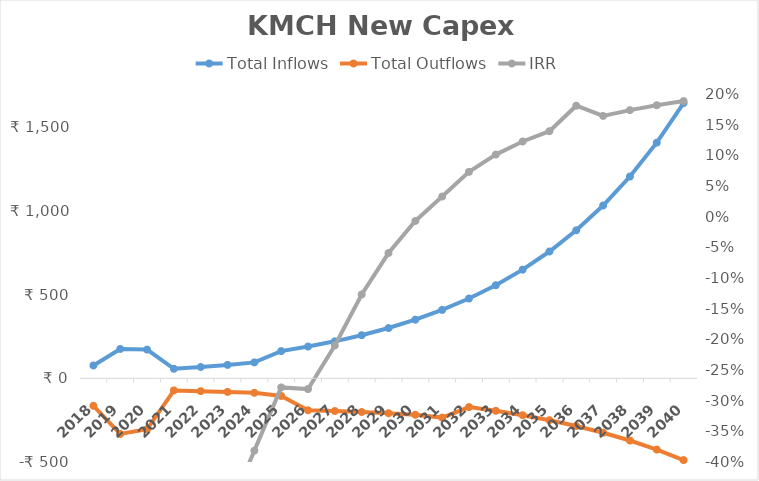
| Category | Total Inflows | Total Outflows |
|---|---|---|
| 2018.0 | 77 | -164.111 |
| 2019.0 | 176 | -332.171 |
| 2020.0 | 172 | -304.372 |
| 2021.0 | 57.296 | -72.133 |
| 2022.0 | 67.898 | -76.31 |
| 2023.0 | 80.465 | -81.055 |
| 2024.0 | 95.363 | -86.462 |
| 2025.0 | 163.026 | -105.145 |
| 2026.0 | 189.975 | -190.882 |
| 2027.0 | 221.415 | -195.234 |
| 2028.0 | 258.102 | -200.996 |
| 2029.0 | 300.916 | -208.391 |
| 2030.0 | 350.891 | -217.685 |
| 2031.0 | 409.232 | -234.638 |
| 2032.0 | 477.352 | -171.555 |
| 2033.0 | 556.903 | -194.053 |
| 2034.0 | 649.817 | -220.023 |
| 2035.0 | 758.356 | -250.036 |
| 2036.0 | 885.167 | -284.761 |
| 2037.0 | 1033.351 | -324.981 |
| 2038.0 | 1206.537 | -371.609 |
| 2039.0 | 1408.972 | -425.717 |
| 2040.0 | 1645.635 | -488.556 |